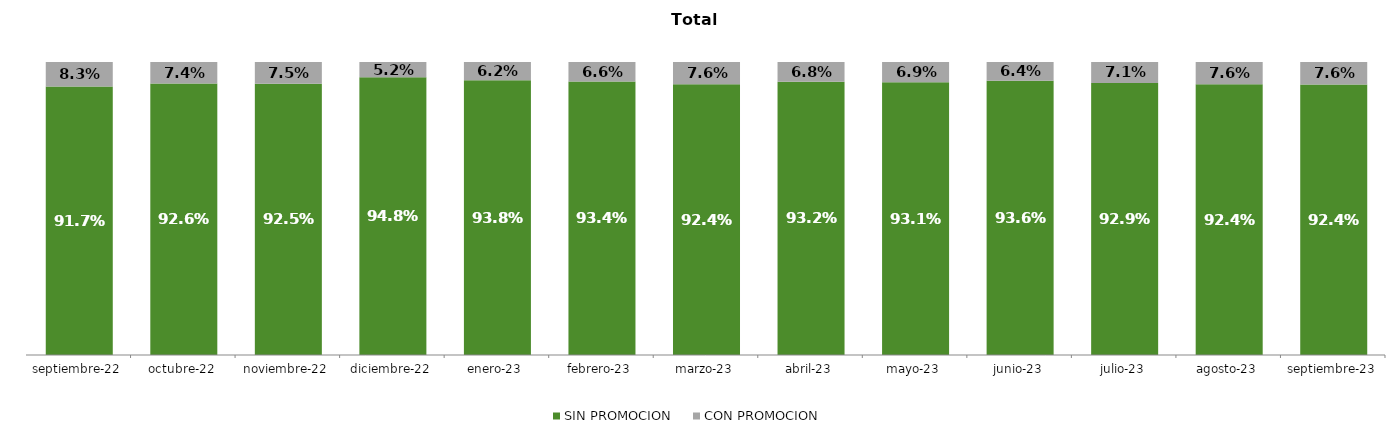
| Category | SIN PROMOCION   | CON PROMOCION   |
|---|---|---|
| 2022-09-01 | 0.917 | 0.083 |
| 2022-10-01 | 0.926 | 0.074 |
| 2022-11-01 | 0.925 | 0.075 |
| 2022-12-01 | 0.948 | 0.052 |
| 2023-01-01 | 0.938 | 0.062 |
| 2023-02-01 | 0.934 | 0.066 |
| 2023-03-01 | 0.924 | 0.076 |
| 2023-04-01 | 0.932 | 0.068 |
| 2023-05-01 | 0.931 | 0.069 |
| 2023-06-01 | 0.936 | 0.064 |
| 2023-07-01 | 0.929 | 0.071 |
| 2023-08-01 | 0.924 | 0.076 |
| 2023-09-01 | 0.924 | 0.076 |